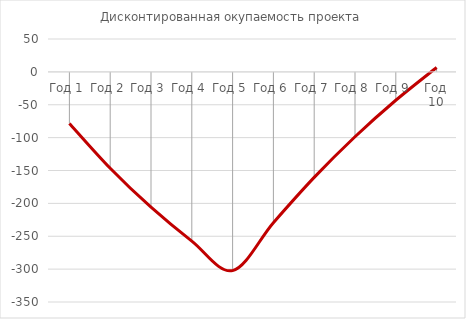
| Category | Дисконтированная окупаемость проекта |
|---|---|
| Год 1 | -78.4 |
| Год 2 | -146.574 |
| Год 3 | -205.856 |
| Год 4 | -257.405 |
| Год 5 | -302.23 |
| Год 6 | -229.368 |
| Год 7 | -160.481 |
| Год 8 | -98.653 |
| Год 9 | -43.162 |
| Год 10 | 6.64 |